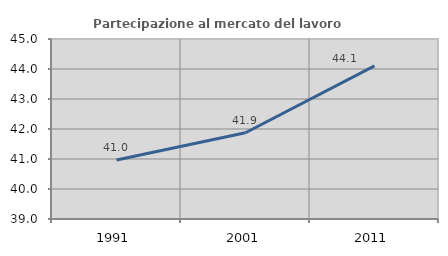
| Category | Partecipazione al mercato del lavoro  femminile |
|---|---|
| 1991.0 | 40.965 |
| 2001.0 | 41.875 |
| 2011.0 | 44.105 |